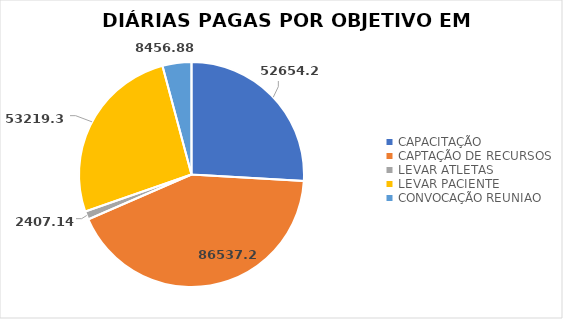
| Category | Total |
|---|---|
| CAPACITAÇÃO | 52654.26 |
| CAPTAÇÃO DE RECURSOS | 86537.27 |
| LEVAR ATLETAS | 2407.14 |
| LEVAR PACIENTE | 53219.39 |
| CONVOCAÇÃO REUNIAO | 8456.88 |